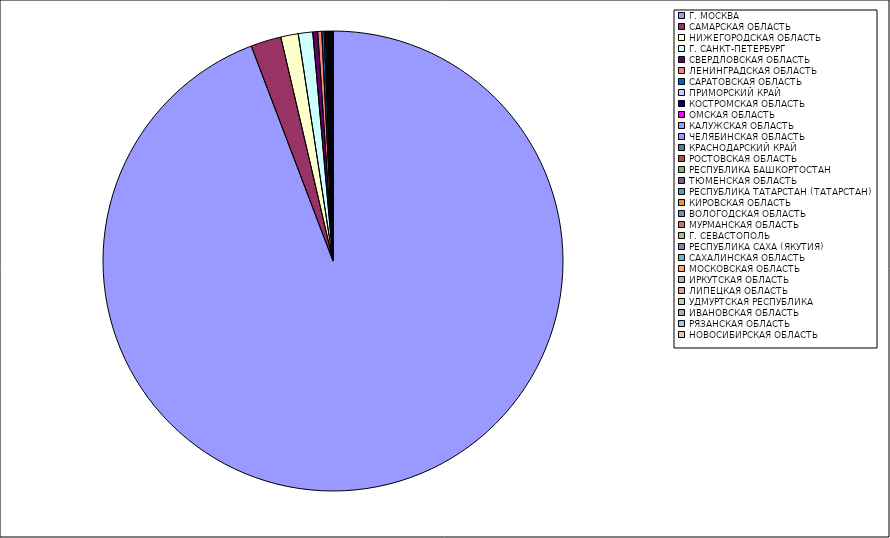
| Category | Оборот |
|---|---|
| Г. МОСКВА | 94.165 |
| САМАРСКАЯ ОБЛАСТЬ | 2.136 |
| НИЖЕГОРОДСКАЯ ОБЛАСТЬ | 1.227 |
| Г. САНКТ-ПЕТЕРБУРГ | 1.013 |
| СВЕРДЛОВСКАЯ ОБЛАСТЬ | 0.345 |
| ЛЕНИНГРАДСКАЯ ОБЛАСТЬ | 0.282 |
| САРАТОВСКАЯ ОБЛАСТЬ | 0.167 |
| ПРИМОРСКИЙ КРАЙ | 0.084 |
| КОСТРОМСКАЯ ОБЛАСТЬ | 0.084 |
| ОМСКАЯ ОБЛАСТЬ | 0.067 |
| КАЛУЖСКАЯ ОБЛАСТЬ | 0.052 |
| ЧЕЛЯБИНСКАЯ ОБЛАСТЬ | 0.034 |
| КРАСНОДАРСКИЙ КРАЙ | 0.034 |
| РОСТОВСКАЯ ОБЛАСТЬ | 0.033 |
| РЕСПУБЛИКА БАШКОРТОСТАН | 0.029 |
| ТЮМЕНСКАЯ ОБЛАСТЬ | 0.027 |
| РЕСПУБЛИКА ТАТАРСТАН (ТАТАРСТАН) | 0.024 |
| КИРОВСКАЯ ОБЛАСТЬ | 0.02 |
| ВОЛОГОДСКАЯ ОБЛАСТЬ | 0.018 |
| МУРМАНСКАЯ ОБЛАСТЬ | 0.015 |
| Г. СЕВАСТОПОЛЬ | 0.013 |
| РЕСПУБЛИКА САХА (ЯКУТИЯ) | 0.013 |
| САХАЛИНСКАЯ ОБЛАСТЬ | 0.01 |
| МОСКОВСКАЯ ОБЛАСТЬ | 0.009 |
| ИРКУТСКАЯ ОБЛАСТЬ | 0.009 |
| ЛИПЕЦКАЯ ОБЛАСТЬ | 0.008 |
| УДМУРТСКАЯ РЕСПУБЛИКА | 0.008 |
| ИВАНОВСКАЯ ОБЛАСТЬ | 0.006 |
| РЯЗАНСКАЯ ОБЛАСТЬ | 0.006 |
| НОВОСИБИРСКАЯ ОБЛАСТЬ | 0.006 |